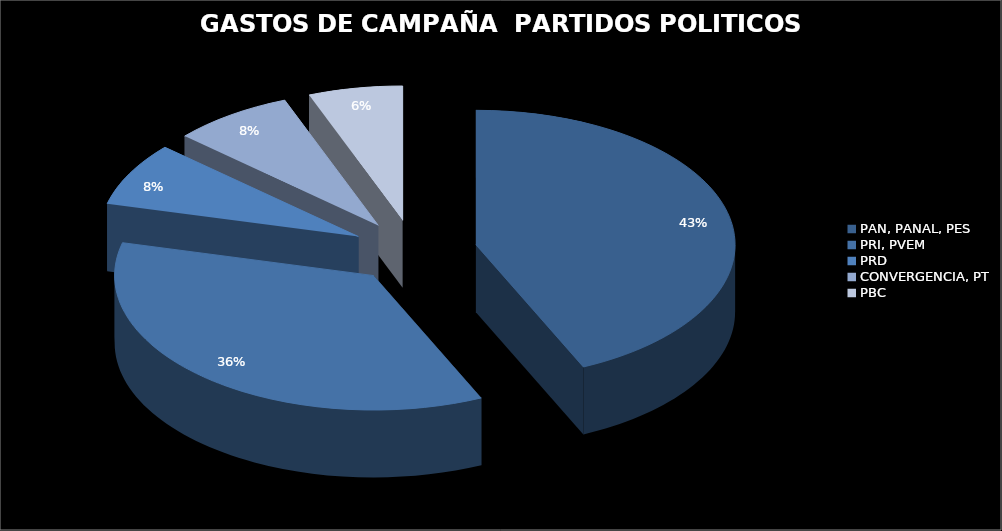
| Category | Series 0 |
|---|---|
| PAN, PANAL, PES | 9280579.77 |
| PRI, PVEM  | 7680346.14 |
| PRD | 1640945.29 |
| CONVERGENCIA, PT | 1621654.29 |
| PBC | 1262736.11 |